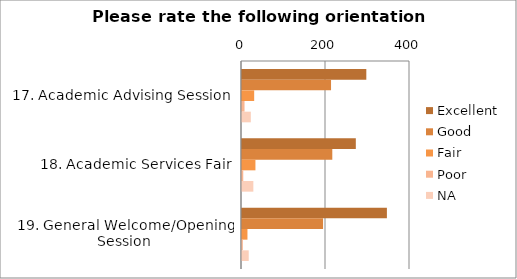
| Category | Excellent | Good | Fair | Poor | NA |
|---|---|---|---|---|---|
| 17. Academic Advising Session | 296 | 212 | 29 | 6 | 21 |
| 18. Academic Services Fair | 271 | 215 | 32 | 3 | 27 |
| 19. General Welcome/Opening Session | 345 | 193 | 13 | 2 | 16 |